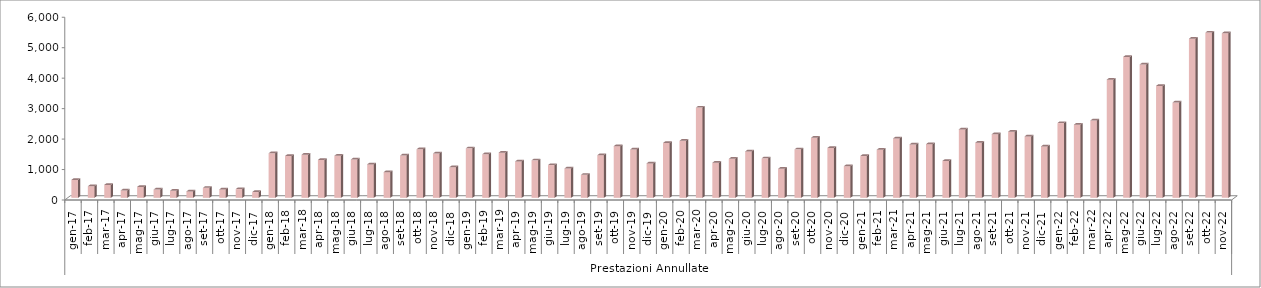
| Category | Series 0 |
|---|---|
| 0 | 589 |
| 1900-01-01 | 381 |
| 1900-01-02 | 426 |
| 1900-01-03 | 242 |
| 1900-01-04 | 359 |
| 1900-01-05 | 272 |
| 1900-01-06 | 232 |
| 1900-01-07 | 211 |
| 1900-01-08 | 328 |
| 1900-01-09 | 277 |
| 1900-01-10 | 288 |
| 1900-01-11 | 190 |
| 1900-01-12 | 1463 |
| 1900-01-13 | 1374 |
| 1900-01-14 | 1415 |
| 1900-01-15 | 1245 |
| 1900-01-16 | 1382 |
| 1900-01-17 | 1258 |
| 1900-01-18 | 1099 |
| 1900-01-19 | 843 |
| 1900-01-20 | 1388 |
| 1900-01-21 | 1594 |
| 1900-01-22 | 1454 |
| 1900-01-23 | 1005 |
| 1900-01-24 | 1625 |
| 1900-01-25 | 1430 |
| 1900-01-26 | 1484 |
| 1900-01-27 | 1196 |
| 1900-01-28 | 1232 |
| 1900-01-29 | 1076 |
| 1900-01-30 | 963 |
| 1900-01-31 | 755 |
| 1900-02-01 | 1400 |
| 1900-02-02 | 1697 |
| 1900-02-03 | 1587 |
| 1900-02-04 | 1131 |
| 1900-02-05 | 1801 |
| 1900-02-06 | 1874 |
| 1900-02-07 | 2963 |
| 1900-02-08 | 1154 |
| 1900-02-09 | 1282 |
| 1900-02-10 | 1525 |
| 1900-02-11 | 1297 |
| 1900-02-12 | 955 |
| 1900-02-13 | 1592 |
| 1900-02-14 | 1971 |
| 1900-02-15 | 1637 |
| 1900-02-16 | 1038 |
| 1900-02-17 | 1373 |
| 1900-02-18 | 1579 |
| 1900-02-19 | 1951 |
| 1900-02-20 | 1754 |
| 1900-02-21 | 1762 |
| 1900-02-22 | 1212 |
| 1900-02-23 | 2248 |
| 1900-02-24 | 1811 |
| 1900-02-25 | 2089 |
| 1900-02-26 | 2173 |
| 1900-02-27 | 2017 |
| 1900-02-28 | 1690 |
| 1900-02-28 | 2455 |
| 1900-03-01 | 2403 |
| 1900-03-02 | 2539 |
| 1900-03-03 | 3881 |
| 1900-03-04 | 4626 |
| 1900-03-05 | 4376 |
| 1900-03-06 | 3675 |
| 1900-03-07 | 3129 |
| 1900-03-08 | 5225 |
| 1900-03-09 | 5426 |
| 1900-03-10 | 5403 |